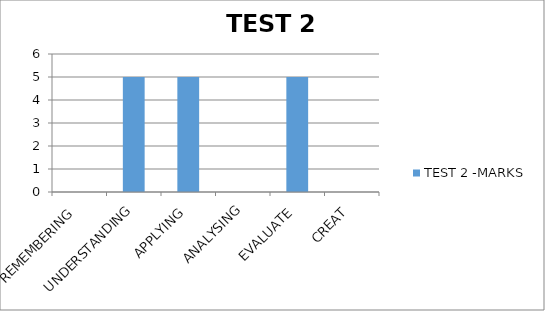
| Category | TEST 2 -MARKS |
|---|---|
| REMEMBERING | 0 |
| UNDERSTANDING | 5 |
| APPLYING | 5 |
| ANALYSING | 0 |
| EVALUATE | 5 |
| CREAT | 0 |